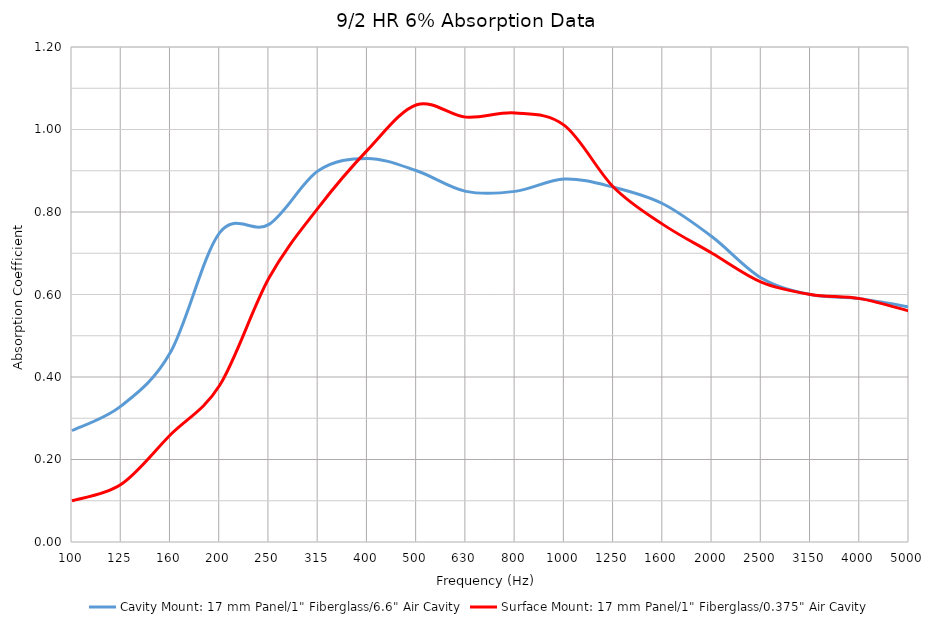
| Category | Cavity Mount: 17 mm Panel/1" Fiberglass/6.6" Air Cavity | Surface Mount: 17 mm Panel/1" Fiberglass/0.375" Air Cavity |
|---|---|---|
| 100.0 | 0.27 | 0.1 |
| 125.0 | 0.33 | 0.14 |
| 160.0 | 0.46 | 0.26 |
| 200.0 | 0.75 | 0.38 |
| 250.0 | 0.77 | 0.64 |
| 315.0 | 0.9 | 0.81 |
| 400.0 | 0.93 | 0.95 |
| 500.0 | 0.9 | 1.06 |
| 630.0 | 0.85 | 1.03 |
| 800.0 | 0.85 | 1.04 |
| 1000.0 | 0.88 | 1.01 |
| 1250.0 | 0.86 | 0.86 |
| 1600.0 | 0.82 | 0.77 |
| 2000.0 | 0.74 | 0.7 |
| 2500.0 | 0.64 | 0.63 |
| 3150.0 | 0.6 | 0.6 |
| 4000.0 | 0.59 | 0.59 |
| 5000.0 | 0.57 | 0.56 |